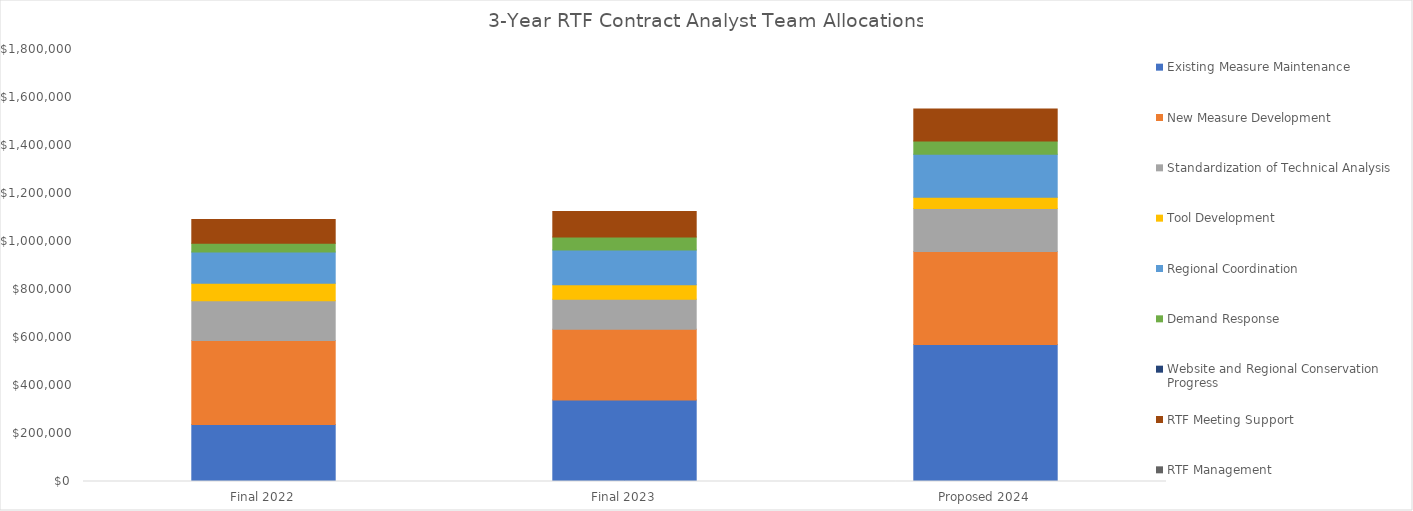
| Category | Existing Measure Maintenance | New Measure Development | Standardization of Technical Analysis | Tool Development | Regional Coordination | Demand Response | Website and Regional Conservation Progress | RTF Meeting Support | RTF Management |
|---|---|---|---|---|---|---|---|---|---|
| Final 2022 | 237000 | 350200 | 165500 | 73500 | 130300 | 36500 | 0 | 98500 | 0 |
| Final 2023 | 340000 | 294500 | 125000 | 60000 | 145000 | 53800 | 0 | 107000 | 0 |
| Proposed 2024 | 571000 | 386900 | 180000 | 46000 | 180100 | 55000 | 0 | 133000 | 0 |